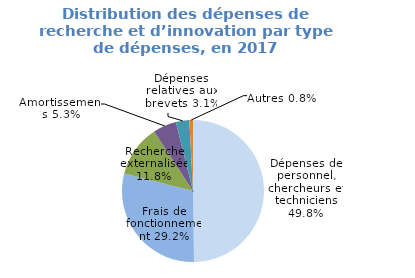
| Category | Series 0 |
|---|---|
| Dépenses de personnel, chercheurs et techniciens | 0.498 |
| Frais de fonctionnement | 0.292 |
| Recherche externalisée | 0.118 |
| Amortissements | 0.053 |
| Dépenses relatives aux brevets | 0.031 |
| Autres | 0.008 |